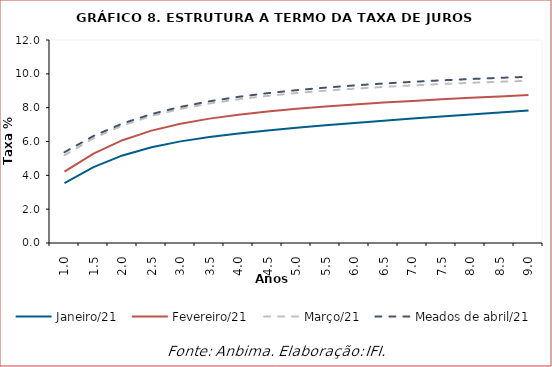
| Category | Janeiro/21 | Fevereiro/21 | Março/21 | Meados de abril/21 |
|---|---|---|---|---|
| 1.0 | 3.535 | 4.221 | 5.187 | 5.367 |
| 1.5 | 4.485 | 5.288 | 6.192 | 6.328 |
| 2.0 | 5.177 | 6.078 | 6.95 | 7.065 |
| 2.5 | 5.662 | 6.643 | 7.509 | 7.622 |
| 3.0 | 6.008 | 7.05 | 7.927 | 8.047 |
| 3.5 | 6.269 | 7.352 | 8.246 | 8.377 |
| 4.0 | 6.478 | 7.586 | 8.496 | 8.641 |
| 4.5 | 6.656 | 7.774 | 8.698 | 8.855 |
| 5.0 | 6.814 | 7.932 | 8.864 | 9.034 |
| 5.5 | 6.961 | 8.068 | 9.003 | 9.185 |
| 6.0 | 7.099 | 8.19 | 9.122 | 9.315 |
| 6.5 | 7.232 | 8.299 | 9.226 | 9.428 |
| 7.0 | 7.359 | 8.4 | 9.316 | 9.527 |
| 7.5 | 7.483 | 8.494 | 9.397 | 9.615 |
| 8.0 | 7.602 | 8.582 | 9.468 | 9.693 |
| 8.5 | 7.718 | 8.666 | 9.532 | 9.763 |
| 9.0 | 7.83 | 8.745 | 9.59 | 9.826 |